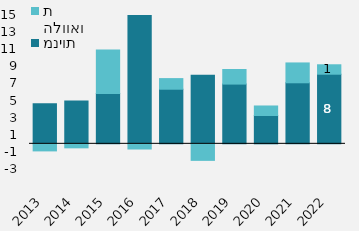
| Category | מניות | הלוואות |
|---|---|---|
| 2013 | 4684.619 | -826.326 |
| 2014 | 4993.013 | -467.51 |
| 2015 | 5883.814 | 5084.686 |
| 2016 | 15183.916 | -605.406 |
| 2017 | 6384.341 | 1239.994 |
| 2018 | 8019.152 | -1932.555 |
| 2019 | 6983.587 | 1706.02 |
| 2020 | 3310.268 | 1114.326 |
| 2021 | 7134.57 | 2321 |
| 2022 | 8138 | 1103 |